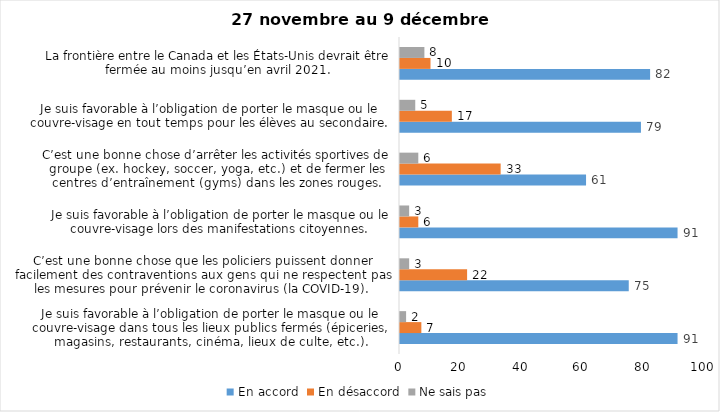
| Category | En accord | En désaccord | Ne sais pas |
|---|---|---|---|
| Je suis favorable à l’obligation de porter le masque ou le couvre-visage dans tous les lieux publics fermés (épiceries, magasins, restaurants, cinéma, lieux de culte, etc.). | 91 | 7 | 2 |
| C’est une bonne chose que les policiers puissent donner facilement des contraventions aux gens qui ne respectent pas les mesures pour prévenir le coronavirus (la COVID-19). | 75 | 22 | 3 |
| Je suis favorable à l’obligation de porter le masque ou le couvre-visage lors des manifestations citoyennes. | 91 | 6 | 3 |
| C’est une bonne chose d’arrêter les activités sportives de groupe (ex. hockey, soccer, yoga, etc.) et de fermer les centres d’entraînement (gyms) dans les zones rouges. | 61 | 33 | 6 |
| Je suis favorable à l’obligation de porter le masque ou le couvre-visage en tout temps pour les élèves au secondaire. | 79 | 17 | 5 |
| La frontière entre le Canada et les États-Unis devrait être fermée au moins jusqu’en avril 2021. | 82 | 10 | 8 |